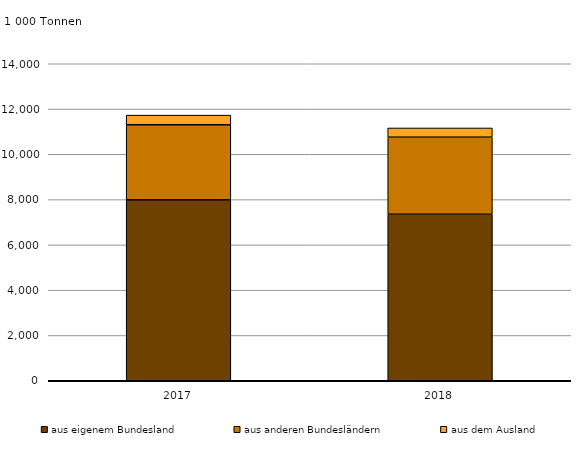
| Category | aus eigenem Bundesland | aus anderen Bundesländern | aus dem Ausland |
|---|---|---|---|
| 2017.0 | 7990194 | 3314901 | 426207 |
| 2018.0 | 7353676 | 3403278 | 407234 |